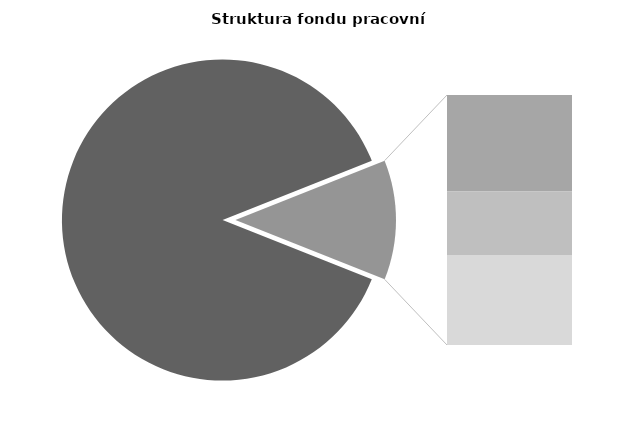
| Category | Series 0 |
|---|---|
| Průměrná měsíční 
odpracovaná doba  
bez přesčasu | 150.871 |
| Dovolená | 7.987 |
| Nemoc | 5.248 |
| Jiné | 7.44 |